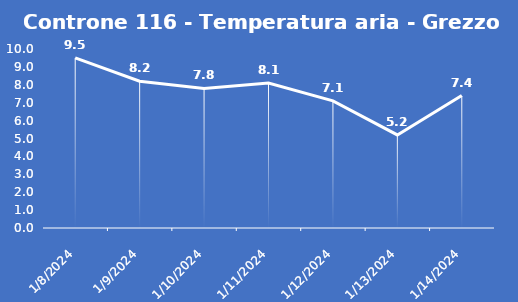
| Category | Controne 116 - Temperatura aria - Grezzo (°C) |
|---|---|
| 1/8/24 | 9.5 |
| 1/9/24 | 8.2 |
| 1/10/24 | 7.8 |
| 1/11/24 | 8.1 |
| 1/12/24 | 7.1 |
| 1/13/24 | 5.2 |
| 1/14/24 | 7.4 |